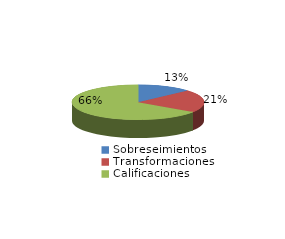
| Category | Series 0 |
|---|---|
| Sobreseimientos | 153 |
| Transformaciones | 244 |
| Calificaciones | 756 |